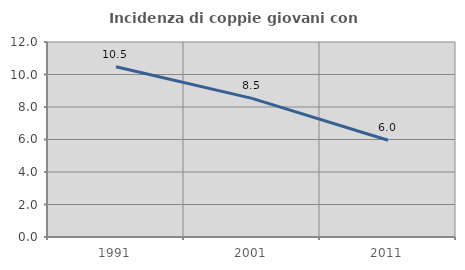
| Category | Incidenza di coppie giovani con figli |
|---|---|
| 1991.0 | 10.476 |
| 2001.0 | 8.531 |
| 2011.0 | 5.957 |